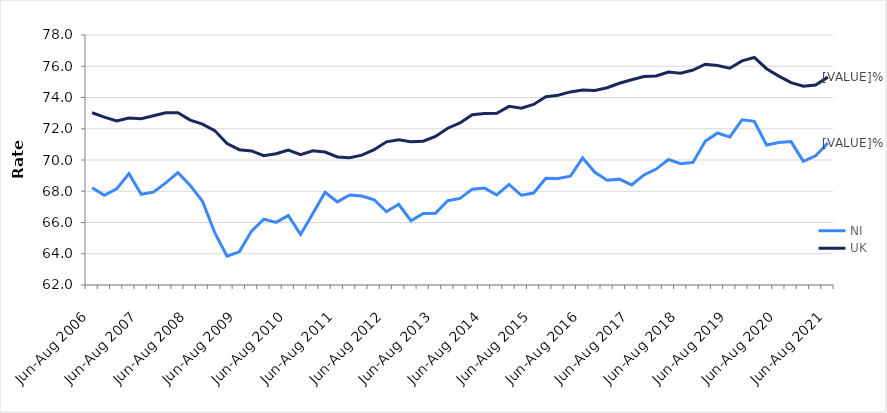
| Category | NI | UK |
|---|---|---|
| Jun-Aug 2006 | 68.228 | 73.023 |
| Sep-Nov 2006 | 67.737 | 72.745 |
| Dec-Feb 2007 | 68.154 | 72.499 |
| Mar-May 2007 | 69.129 | 72.691 |
| Jun-Aug 2007 | 67.802 | 72.644 |
| Sep-Nov 2007 | 67.944 | 72.83 |
| Dec-Feb 2008 | 68.532 | 73.021 |
| Mar-May 2008 | 69.193 | 73.027 |
| Jun-Aug 2008 | 68.372 | 72.555 |
| Sep-Nov 2008 | 67.357 | 72.291 |
| Dec-Feb 2009 | 65.352 | 71.882 |
| Mar-May 2009 | 63.847 | 71.049 |
| Jun-Aug 2009 | 64.122 | 70.661 |
| Sep-Nov 2009 | 65.451 | 70.579 |
| Dec-Feb 2010 | 66.217 | 70.28 |
| Mar-May 2010 | 66.009 | 70.398 |
| Jun-Aug 2010 | 66.442 | 70.639 |
| Sep-Nov 2010 | 65.232 | 70.339 |
| Dec-Feb 2011 | 66.574 | 70.586 |
| Mar-May 2011 | 67.937 | 70.512 |
| Jun-Aug 2011 | 67.32 | 70.195 |
| Sep-Nov 2011 | 67.762 | 70.145 |
| Dec-Feb 2012 | 67.69 | 70.313 |
| Mar-May 2012 | 67.458 | 70.66 |
| Jun-Aug 2012 | 66.691 | 71.164 |
| Sep-Nov 2012 | 67.167 | 71.29 |
| Dec-Feb 2013 | 66.112 | 71.163 |
| Mar-May 2013 | 66.574 | 71.205 |
| Jun-Aug 2013 | 66.587 | 71.509 |
| Sep-Nov 2013 | 67.397 | 72.034 |
| Dec-Feb 2014 | 67.54 | 72.373 |
| Mar-May 2014 | 68.133 | 72.903 |
| Jun-Aug 2014 | 68.203 | 72.974 |
| Sep-Nov 2014 | 67.762 | 72.993 |
| Dec-Feb 2015 | 68.44 | 73.433 |
| Mar-May 2015 | 67.744 | 73.309 |
| Jun-Aug 2015 | 67.887 | 73.559 |
| Sep-Nov 2015 | 68.833 | 74.049 |
| Dec-Feb 2016 | 68.816 | 74.14 |
| Mar-May 2016 | 68.959 | 74.357 |
| Jun-Aug 2016 | 70.127 | 74.486 |
| Sep-Nov 2016 | 69.214 | 74.447 |
| Dec-Feb 2017 | 68.706 | 74.624 |
| Mar-May 2017 | 68.774 | 74.909 |
| Jun-Aug 2017 | 68.402 | 75.138 |
| Sep-Nov 2017 | 69.045 | 75.338 |
| Dec-Feb 2018 | 69.419 | 75.375 |
| Mar-May 2018 | 70.029 | 75.632 |
| Jun-Aug 2018 | 69.765 | 75.557 |
| Sep-Nov 2018 | 69.845 | 75.761 |
| Dec-Feb 2019 | 71.196 | 76.127 |
| Mar-May 2019 | 71.727 | 76.049 |
| Jun-Aug 2019 | 71.467 | 75.874 |
| Sep-Nov 2019 | 72.576 | 76.343 |
| Dec-Feb 2020 | 72.473 | 76.562 |
| Mar-May 2020 | 70.959 | 75.842 |
| Jun-Aug 2020 | 71.117 | 75.37 |
| Sep-Nov 2020 | 71.178 | 74.949 |
| Dec-Feb 2021 | 69.913 | 74.721 |
| Mar-May 2021 | 70.264 | 74.805 |
| Jun-Aug 2021 | 71.083 | 75.304 |